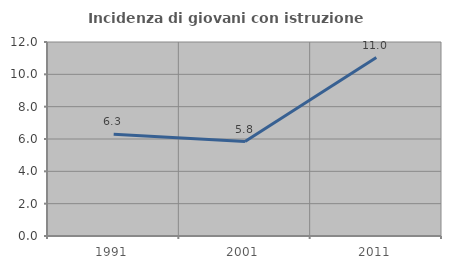
| Category | Incidenza di giovani con istruzione universitaria |
|---|---|
| 1991.0 | 6.294 |
| 2001.0 | 5.839 |
| 2011.0 | 11.034 |